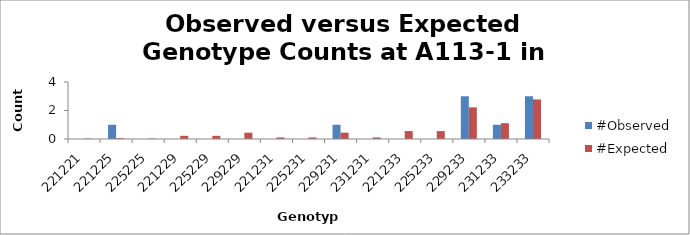
| Category | #Observed | #Expected |
|---|---|---|
| 221221.0 | 0 | 0.028 |
| 221225.0 | 1 | 0.056 |
| 225225.0 | 0 | 0.028 |
| 221229.0 | 0 | 0.222 |
| 225229.0 | 0 | 0.222 |
| 229229.0 | 0 | 0.444 |
| 221231.0 | 0 | 0.111 |
| 225231.0 | 0 | 0.111 |
| 229231.0 | 1 | 0.444 |
| 231231.0 | 0 | 0.111 |
| 221233.0 | 0 | 0.556 |
| 225233.0 | 0 | 0.556 |
| 229233.0 | 3 | 2.222 |
| 231233.0 | 1 | 1.111 |
| 233233.0 | 3 | 2.778 |